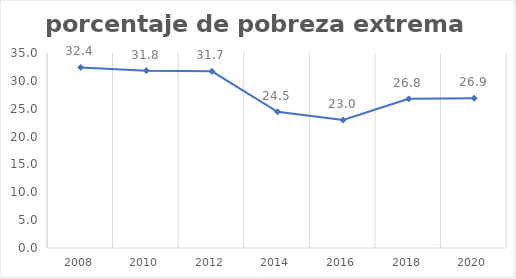
| Category | Series 0 |
|---|---|
| 2008.0 | 32.405 |
| 2010.0 | 31.83 |
| 2012.0 | 31.711 |
| 2014.0 | 24.452 |
| 2016.0 | 22.962 |
| 2018.0 | 26.769 |
| 2020.0 | 26.886 |